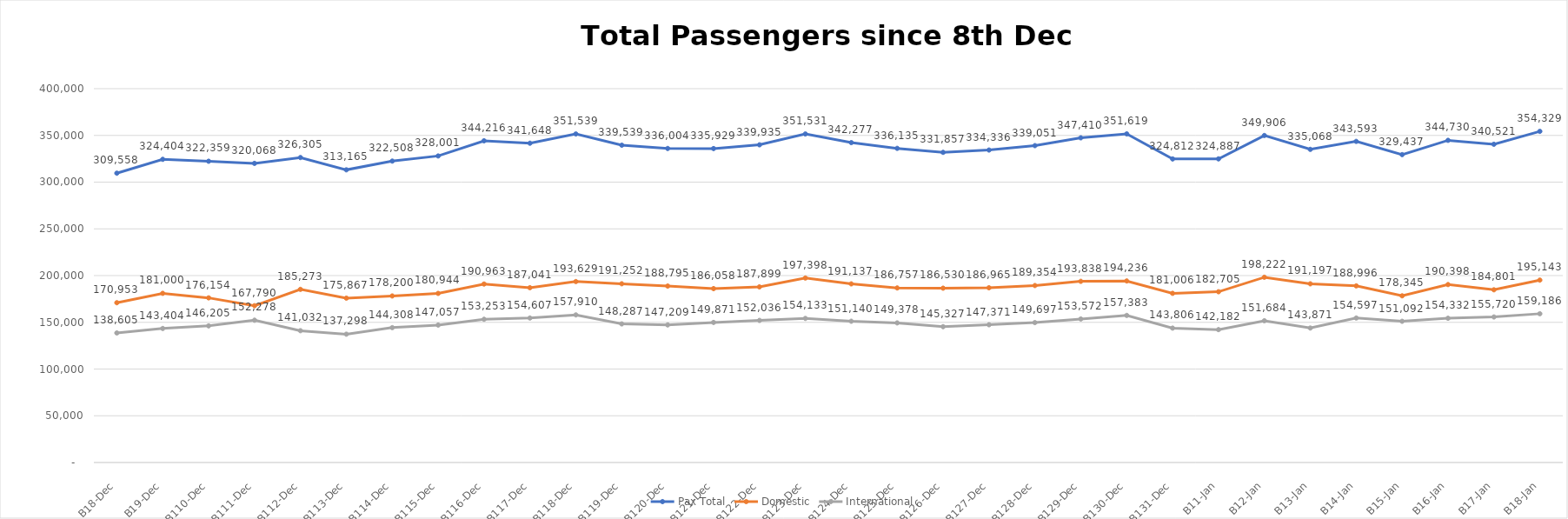
| Category | Pax Total |  Domestic  |  International  |
|---|---|---|---|
| 2022-12-08 | 309558 | 170953 | 138605 |
| 2022-12-09 | 324404 | 181000 | 143404 |
| 2022-12-10 | 322359 | 176154 | 146205 |
| 2022-12-11 | 320068 | 167790 | 152278 |
| 2022-12-12 | 326305 | 185273 | 141032 |
| 2022-12-13 | 313165 | 175867 | 137298 |
| 2022-12-14 | 322508 | 178200 | 144308 |
| 2022-12-15 | 328001 | 180944 | 147057 |
| 2022-12-16 | 344216 | 190963 | 153253 |
| 2022-12-17 | 341648 | 187041 | 154607 |
| 2022-12-18 | 351539 | 193629 | 157910 |
| 2022-12-19 | 339539 | 191252 | 148287 |
| 2022-12-20 | 336004 | 188795 | 147209 |
| 2022-12-21 | 335929 | 186058 | 149871 |
| 2022-12-22 | 339935 | 187899 | 152036 |
| 2022-12-23 | 351531 | 197398 | 154133 |
| 2022-12-24 | 342277 | 191137 | 151140 |
| 2022-12-25 | 336135 | 186757 | 149378 |
| 2022-12-26 | 331857 | 186530 | 145327 |
| 2022-12-27 | 334336 | 186965 | 147371 |
| 2022-12-28 | 339051 | 189354 | 149697 |
| 2022-12-29 | 347410 | 193838 | 153572 |
| 2022-12-30 | 351619 | 194236 | 157383 |
| 2022-12-31 | 324812 | 181006 | 143806 |
| 2023-01-01 | 324887 | 182705 | 142182 |
| 2023-01-02 | 349906 | 198222 | 151684 |
| 2023-01-03 | 335068 | 191197 | 143871 |
| 2023-01-04 | 343593 | 188996 | 154597 |
| 2023-01-05 | 329437 | 178345 | 151092 |
| 2023-01-06 | 344730 | 190398 | 154332 |
| 2023-01-07 | 340521 | 184801 | 155720 |
| 2023-01-08 | 354329 | 195143 | 159186 |